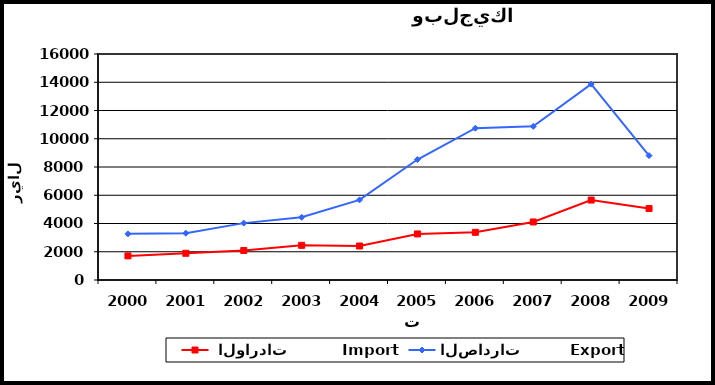
| Category |  الواردات           Import | الصادرات          Export |
|---|---|---|
| 2000.0 | 1707 | 3267 |
| 2001.0 | 1892 | 3314 |
| 2002.0 | 2089 | 4027 |
| 2003.0 | 2454 | 4440 |
| 2004.0 | 2407 | 5673 |
| 2005.0 | 3261 | 8528 |
| 2006.0 | 3376 | 10746 |
| 2007.0 | 4109 | 10877 |
| 2008.0 | 5660 | 13867 |
| 2009.0 | 5058 | 8807 |